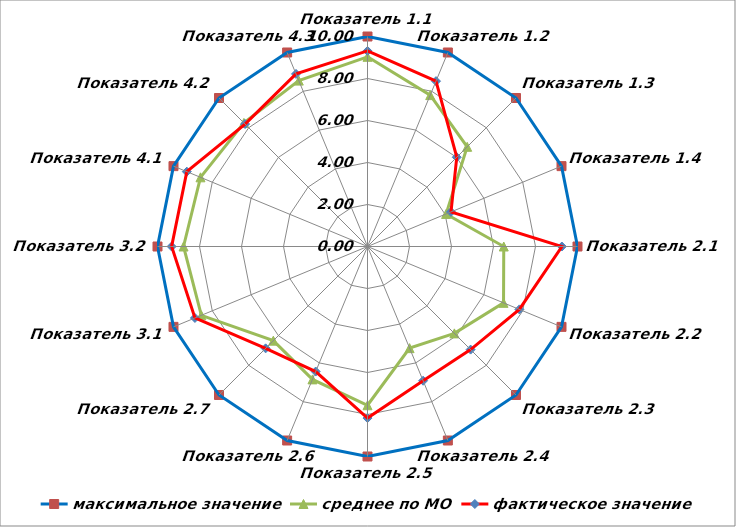
| Category | максимальное значение | среднее по МО | фактическое значение |
|---|---|---|---|
| Показатель 1.1 | 10 | 9.033 | 9.312 |
| Показатель 1.2 | 10 | 7.803 | 8.524 |
| Показатель 1.3 | 10 | 6.713 | 6.012 |
| Показатель 1.4 | 10 | 4.051 | 4.304 |
| Показатель 2.1 | 10 | 6.489 | 9.257 |
| Показатель 2.2 | 10 | 7.011 | 7.827 |
| Показатель 2.3 | 10 | 5.851 | 6.943 |
| Показатель 2.4 | 10 | 5.239 | 6.918 |
| Показатель 2.5 | 10 | 7.56 | 8.17 |
| Показатель 2.6 | 10 | 6.849 | 6.444 |
| Показатель 2.7 | 10 | 6.342 | 6.86 |
| Показатель 3.1 | 10 | 8.563 | 8.894 |
| Показатель 3.2 | 10 | 8.76 | 9.327 |
| Показатель 4.1 | 10 | 8.608 | 9.313 |
| Показатель 4.2 | 10 | 8.323 | 8.245 |
| Показатель 4.3 | 10 | 8.551 | 8.894 |